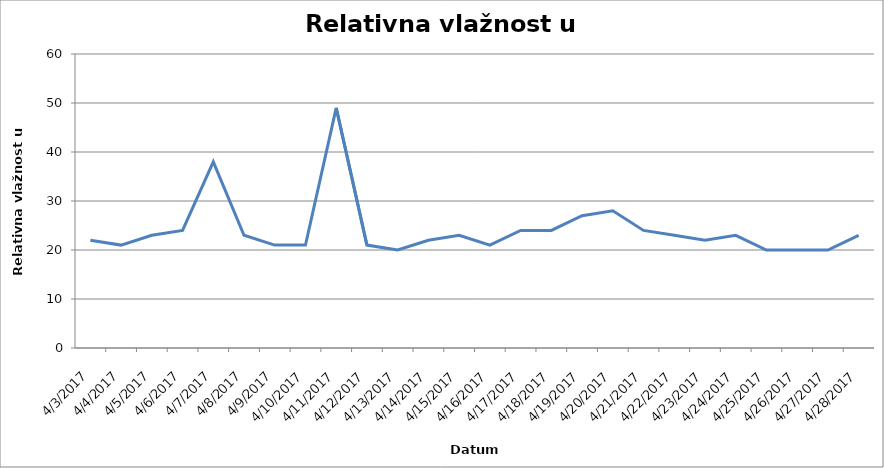
| Category | Vlaga 
zraka u % |
|---|---|
| 2017-04-03 | 22 |
| 2017-04-04 | 21 |
| 2017-04-05 | 23 |
| 2017-04-06 | 24 |
| 2017-04-07 | 38 |
| 2017-04-08 | 23 |
| 2017-04-09 | 21 |
| 2017-04-10 | 21 |
| 2017-04-11 | 49 |
| 2017-04-12 | 21 |
| 2017-04-13 | 20 |
| 2017-04-14 | 22 |
| 2017-04-15 | 23 |
| 2017-04-16 | 21 |
| 2017-04-17 | 24 |
| 2017-04-18 | 24 |
| 2017-04-19 | 27 |
| 2017-04-20 | 28 |
| 2017-04-21 | 24 |
| 2017-04-22 | 23 |
| 2017-04-23 | 22 |
| 2017-04-24 | 23 |
| 2017-04-25 | 20 |
| 2017-04-26 | 20 |
| 2017-04-27 | 20 |
| 2017-04-28 | 23 |